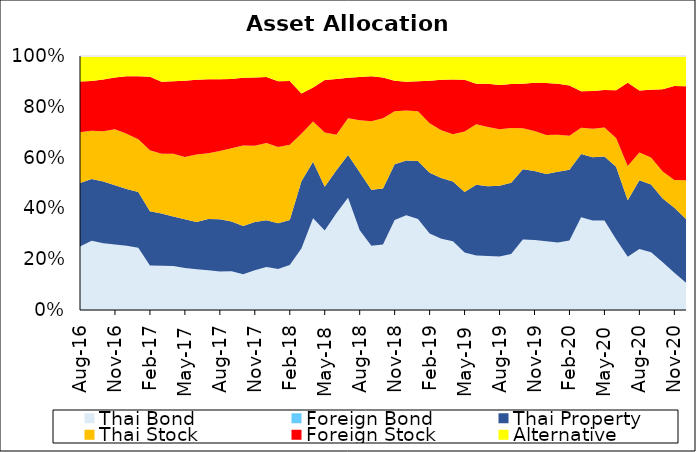
| Category | Thai Bond | Foreign Bond | Thai Property | Thai Stock | Foreign Stock | Alternative |
|---|---|---|---|---|---|---|
| 2016-08-31 | 0.25 | 0 | 0.25 | 0.2 | 0.2 | 0.1 |
| 2016-09-30 | 0.273 | 0 | 0.243 | 0.19 | 0.196 | 0.099 |
| 2016-10-31 | 0.263 | 0 | 0.243 | 0.197 | 0.204 | 0.092 |
| 2016-11-30 | 0.258 | 0 | 0.234 | 0.22 | 0.204 | 0.084 |
| 2016-12-30 | 0.253 | 0 | 0.223 | 0.218 | 0.226 | 0.08 |
| 2017-01-31 | 0.245 | 0 | 0.22 | 0.208 | 0.248 | 0.08 |
| 2017-02-28 | 0.175 | 0 | 0.214 | 0.24 | 0.289 | 0.082 |
| 2017-03-31 | 0.174 | 0 | 0.206 | 0.235 | 0.284 | 0.101 |
| 2017-04-28 | 0.174 | 0 | 0.197 | 0.248 | 0.287 | 0.1 |
| 2017-05-31 | 0.165 | 0 | 0.192 | 0.245 | 0.3 | 0.098 |
| 2017-06-30 | 0.161 | 0 | 0.186 | 0.266 | 0.294 | 0.094 |
| 2017-07-31 | 0.156 | 0 | 0.202 | 0.259 | 0.291 | 0.092 |
| 2017-08-31 | 0.152 | 0 | 0.206 | 0.268 | 0.282 | 0.092 |
| 2017-09-29 | 0.152 | 0 | 0.196 | 0.289 | 0.272 | 0.091 |
| 2017-10-31 | 0.14 | 0 | 0.19 | 0.317 | 0.267 | 0.086 |
| 2017-11-30 | 0.156 | 0 | 0.191 | 0.3 | 0.268 | 0.085 |
| 2017-12-29 | 0.169 | 0 | 0.185 | 0.303 | 0.26 | 0.083 |
| 2018-01-31 | 0.161 | 0 | 0.18 | 0.3 | 0.259 | 0.1 |
| 2018-02-28 | 0.177 | 0 | 0.176 | 0.296 | 0.251 | 0.098 |
| 2018-03-30 | 0.196 | 0 | 0.215 | 0.152 | 0.129 | 0.119 |
| 2018-04-30 | 0.347 | 0 | 0.215 | 0.152 | 0.129 | 0.119 |
| 2018-05-31 | 0.313 | 0 | 0.172 | 0.214 | 0.207 | 0.094 |
| 2018-06-29 | 0.381 | 0 | 0.169 | 0.14 | 0.219 | 0.091 |
| 2018-07-31 | 0.441 | 0 | 0.169 | 0.145 | 0.16 | 0.086 |
| 2018-08-31 | 0.314 | 0 | 0.228 | 0.205 | 0.17 | 0.083 |
| 2018-09-28 | 0.253 | 0 | 0.221 | 0.27 | 0.177 | 0.08 |
| 2018-10-31 | 0.258 | 0 | 0.221 | 0.276 | 0.161 | 0.084 |
| 2018-11-30 | 0.354 | 0 | 0.22 | 0.208 | 0.121 | 0.097 |
| 2018-12-28 | 0.373 | 0 | 0.216 | 0.197 | 0.113 | 0.101 |
| 2019-01-31 | 0.358 | 0 | 0.228 | 0.196 | 0.118 | 0.1 |
| 2019-02-28 | 0.302 | 0 | 0.239 | 0.195 | 0.167 | 0.098 |
| 2019-03-29 | 0.281 | 0 | 0.239 | 0.188 | 0.199 | 0.093 |
| 2019-04-30 | 0.271 | 0 | 0.235 | 0.186 | 0.215 | 0.093 |
| 2019-05-31 | 0.227 | 0 | 0.238 | 0.238 | 0.203 | 0.093 |
| 2019-06-28 | 0.214 | 0 | 0.279 | 0.238 | 0.159 | 0.109 |
| 2019-07-31 | 0.212 | 0 | 0.275 | 0.233 | 0.17 | 0.11 |
| 2019-08-30 | 0.211 | 0 | 0.278 | 0.222 | 0.174 | 0.114 |
| 2019-09-30 | 0.22 | 0 | 0.281 | 0.216 | 0.173 | 0.11 |
| 2019-10-31 | 0.277 | 0 | 0.277 | 0.161 | 0.175 | 0.11 |
| 2019-11-29 | 0.276 | 0 | 0.272 | 0.158 | 0.19 | 0.105 |
| 2019-12-30 | 0.271 | 0 | 0.265 | 0.153 | 0.204 | 0.106 |
| 2020-01-31 | 0.266 | 0 | 0.278 | 0.146 | 0.201 | 0.109 |
| 2020-02-28 | 0.273 | 0 | 0.279 | 0.134 | 0.198 | 0.116 |
| 2020-03-31 | 0.366 | 0 | 0.249 | 0.103 | 0.144 | 0.138 |
| 2020-04-30 | 0.352 | 0 | 0.249 | 0.112 | 0.149 | 0.137 |
| 2020-05-29 | 0.352 | 0 | 0.252 | 0.114 | 0.148 | 0.134 |
| 2020-06-30 | 0.278 | 0 | 0.286 | 0.113 | 0.188 | 0.134 |
| 2020-07-31 | 0.237 | 0 | 0.251 | 0.152 | 0.37 | 0.119 |
| 2020-08-31 | 0.24 | 0 | 0.27 | 0.11 | 0.244 | 0.136 |
| 2020-09-30 | 0.227 | 0 | 0.267 | 0.106 | 0.267 | 0.133 |
| 2020-10-30 | 0.188 | 0 | 0.251 | 0.106 | 0.324 | 0.131 |
| 2020-11-30 | 0.147 | 0 | 0.255 | 0.11 | 0.37 | 0.118 |
| 2020-12-30 | 0.108 | 0 | 0.251 | 0.152 | 0.37 | 0.119 |